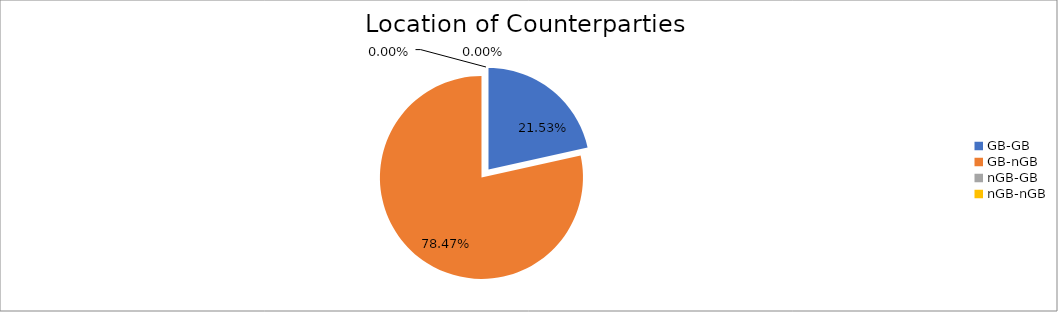
| Category | Series 0 |
|---|---|
| GB-GB | 1949368.529 |
| GB-nGB | 7106555.96 |
| nGB-GB | 1.517 |
| nGB-nGB | 324.271 |